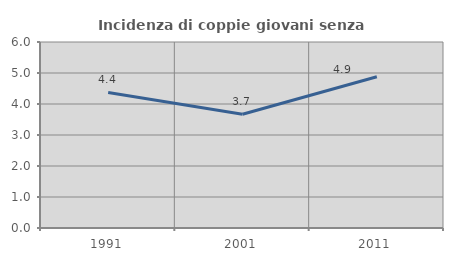
| Category | Incidenza di coppie giovani senza figli |
|---|---|
| 1991.0 | 4.374 |
| 2001.0 | 3.671 |
| 2011.0 | 4.878 |